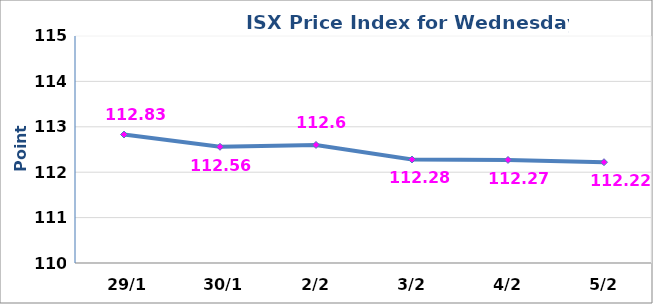
| Category | 2014 |
|---|---|
|  29/1 | 112.83 |
|  30/1 | 112.56 |
|  2/2 | 112.6 |
|  3/2 | 112.28 |
|  4/2 | 112.27 |
|  5/2 | 112.22 |